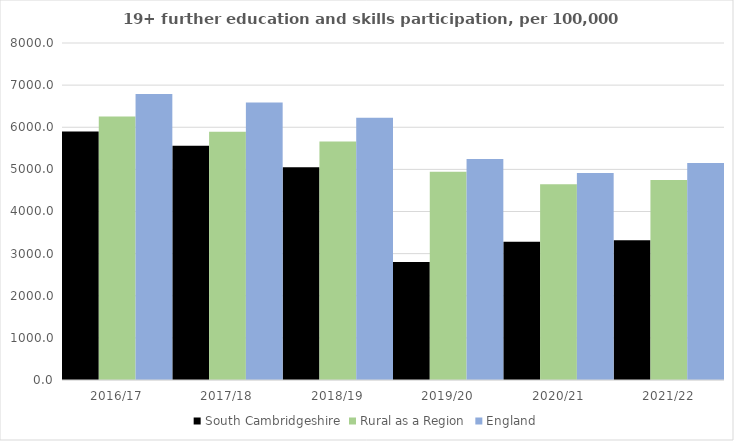
| Category | South Cambridgeshire | Rural as a Region | England |
|---|---|---|---|
| 2016/17 | 5901 | 6253.401 | 6788 |
| 2017/18 | 5563 | 5892.029 | 6588 |
| 2018/19 | 5050 | 5661.873 | 6227 |
| 2019/20 | 2799 | 4943.801 | 5244 |
| 2020/21 | 3280 | 4646.727 | 4913 |
| 2021/22 | 3320 | 4747.049 | 5151 |